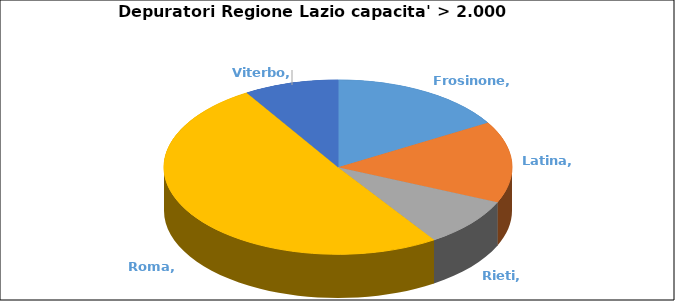
| Category | Series 0 |
|---|---|
| Frosinone | 47 |
| Latina | 43 |
| Rieti | 26 |
| Roma | 144 |
| Viterbo | 25 |